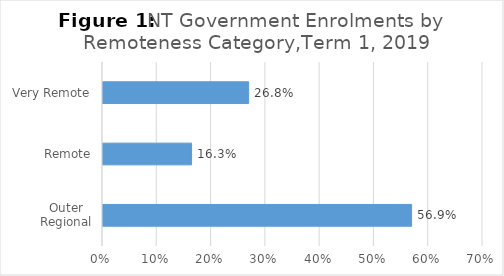
| Category | Term 1 Enrolment |
|---|---|
| Outer Regional | 0.569 |
| Remote | 0.163 |
| Very Remote | 0.268 |